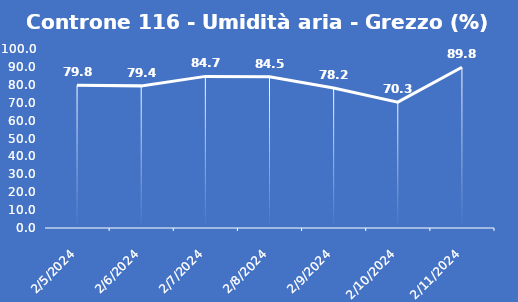
| Category | Controne 116 - Umidità aria - Grezzo (%) |
|---|---|
| 2/5/24 | 79.8 |
| 2/6/24 | 79.4 |
| 2/7/24 | 84.7 |
| 2/8/24 | 84.5 |
| 2/9/24 | 78.2 |
| 2/10/24 | 70.3 |
| 2/11/24 | 89.8 |